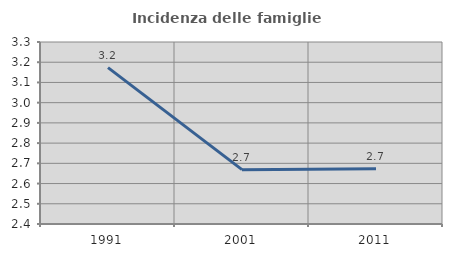
| Category | Incidenza delle famiglie numerose |
|---|---|
| 1991.0 | 3.173 |
| 2001.0 | 2.669 |
| 2011.0 | 2.673 |